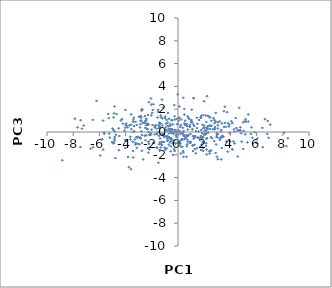
| Category | Series 0 |
|---|---|
| 6.047034312279502 | -0.993 |
| 1.8996415110933844 | -0.432 |
| 4.231998936353665 | -0.823 |
| 0.18424948059864074 | 0.434 |
| 3.832025674823919 | 0.765 |
| -3.248866115887301 | -0.96 |
| 2.361013082048552 | 1.36 |
| 2.519378961224598 | -0.454 |
| 0.8055621066655785 | -0.294 |
| 1.7405133993649038 | -0.354 |
| 3.6809694284060575 | -0.83 |
| 6.4729836015165505 | -1.332 |
| 1.1503002455104683 | -1.67 |
| -0.8302675615321096 | -0.552 |
| -0.7054473988117025 | 0.294 |
| 2.9548716284844923 | -0.358 |
| -3.1940596233818517 | -0.459 |
| 5.570983580629423 | -0.165 |
| 2.8751999732698335 | 1.681 |
| 1.2347217935646153 | 0.522 |
| 0.17790151491282047 | -0.185 |
| 3.9459608068082357 | -0.079 |
| 1.1096616695970796 | -1.199 |
| -3.925786178368599 | 0.572 |
| -2.21898946388357 | 2.611 |
| -6.6776213586947835 | -1.469 |
| -2.4793760931375233 | -0.722 |
| 0.6887620759695077 | 0.515 |
| -1.075818860944802 | -0.87 |
| 3.3772063206595346 | -0.333 |
| -2.7048244669344097 | 0.816 |
| -0.3198153434971519 | -0.745 |
| -4.918262225420026 | 1.279 |
| 1.988664589938669 | 2.692 |
| 0.47107407562630577 | -0.642 |
| -4.083281985070939 | 0.126 |
| 1.5669068762861806 | 0.048 |
| -2.89432349895327 | -0.485 |
| -2.528528512934547 | 1.397 |
| 0.41982239258789356 | -2.176 |
| 1.170124641809719 | -1.154 |
| -4.685951260612254 | 1.58 |
| -5.775517561604449 | -0.64 |
| -4.523972928316377 | 0.325 |
| -3.421533820116227 | 0.889 |
| -0.7757837348047522 | -0.715 |
| -1.5576950573239365 | 1.27 |
| 1.9193546418611314 | 0.329 |
| -0.2960340215029972 | -1.508 |
| -4.735814020955431 | -0.244 |
| -0.024902906210938623 | 0.059 |
| 1.4404870391792788 | -1.427 |
| 0.304540486284339 | -0.636 |
| 2.8747498922688752 | 0.923 |
| -1.045334313289163 | -0.288 |
| -2.42587581993685 | 1.046 |
| -2.7607142642447724 | -0.969 |
| 0.4854808519319678 | -0.341 |
| 5.676815686271187 | -0.51 |
| -2.636931687253922 | 0.791 |
| -0.7636856219395758 | -0.479 |
| 0.5521397763395441 | -0.544 |
| -1.6317442058879152 | 0.289 |
| 3.9664224242571438 | -0.098 |
| 8.382512100155447 | -0.542 |
| -3.7130340036089184 | 0.587 |
| -6.484427661128977 | -1.337 |
| -3.58727059686314 | 0.643 |
| 1.444864968422234 | 0.348 |
| -0.6792092444338018 | -0.458 |
| 1.604191951293681 | 1.05 |
| -2.1060598975750118 | -0.14 |
| 1.799950785334005 | -0.499 |
| 1.9866745134238675 | 0.553 |
| -0.6936915168886623 | -0.122 |
| 3.659139322017527 | 0.461 |
| 3.0450847434661554 | -2.384 |
| -3.065302933638145 | -0.417 |
| 0.48198570194440965 | 0.744 |
| 2.7916170805463723 | 0.773 |
| -0.9099055100206055 | 0.729 |
| 0.1184011563094833 | -0.932 |
| -4.508808416538954 | -1.596 |
| -1.7622735394111921 | 0.514 |
| 2.8167170306723492 | 0.441 |
| -5.283950764653616 | 1.22 |
| -0.35536315168584215 | -0.906 |
| -1.3796207045761866 | 0.74 |
| 5.850181587923567 | -0.007 |
| 2.501218291394947 | 0.539 |
| -2.5051904062654407 | 0.948 |
| -4.883248956831498 | -0.974 |
| 5.2981229512648005 | -0.909 |
| -0.265843969195275 | 1.381 |
| -1.2183488364663433 | -0.869 |
| 1.0209518362009546 | 0.963 |
| -0.8116686827692546 | -0.783 |
| -2.5355900747426117 | 0.802 |
| -1.1125451588328412 | -0.181 |
| -1.4187102640186997 | 0.354 |
| 1.1910837313397633 | 2.965 |
| -0.17987993146862838 | 0.17 |
| 2.38035865832213 | -1.701 |
| 1.1674781154926546 | 0.661 |
| 0.896058703423259 | 0.631 |
| 2.29369975550485 | 0.531 |
| 0.8605682314295295 | 1.156 |
| 0.1919262527514494 | -0.761 |
| 2.167766857991595 | -0.606 |
| -5.335974688399443 | 1.588 |
| 2.026666344309751 | 0.388 |
| -7.4352718826652335 | 1.036 |
| -2.2526189365044536 | -1.808 |
| 2.078826657869659 | -0.222 |
| 0.7950794284432429 | 1.214 |
| -1.072260631984391 | -0.403 |
| 4.578007614451878 | 0.134 |
| 1.2545820243692722 | -1.117 |
| -0.5745031944184031 | -0.622 |
| 5.1349374946405995 | -0.213 |
| -1.9731602613624752 | 1.68 |
| 1.746129268348774 | 1.242 |
| 4.0793424784092736 | 0.947 |
| 1.1964035936522326 | 2.989 |
| -4.926710473345753 | 0.181 |
| -1.3683910780709354 | -0.564 |
| 3.357360806661292 | 0.763 |
| -2.253547457461101 | -0.858 |
| 2.668259638364255 | 0.246 |
| 0.3912181161865333 | -0.072 |
| -2.3794163826329813 | 0.608 |
| -4.031219274384661 | 0.381 |
| -0.060685159703506575 | -0.185 |
| -1.196940878067872 | 1.199 |
| 7.037137703415545 | 0.646 |
| 5.3639202642871595 | 1.545 |
| -4.837399679571421 | -0.605 |
| 3.2972030561913166 | -2.404 |
| 3.05183030810398 | 0.588 |
| 3.3476779456081256 | -1.407 |
| -0.6088735106832407 | -0.912 |
| 0.6487391303288671 | -2.173 |
| 2.2635482388378416 | 0.255 |
| -3.3408332668856255 | 0.05 |
| -2.820178465602557 | 1.388 |
| -2.036105686398353 | 1.462 |
| 0.17883212730047535 | -1.029 |
| 2.214773910416551 | 3.139 |
| 0.03677559822935879 | 0.146 |
| -0.10913993238080572 | -0.446 |
| 2.6077615028975165 | -0.544 |
| 5.171701051093329 | 0.883 |
| 2.976557804743357 | -2.164 |
| -3.0950164000627454 | -1.021 |
| -1.37561535406722 | -0.896 |
| -1.3201166672341729 | 1.451 |
| 5.129643257385111 | 0.978 |
| -5.646186959080073 | -0.046 |
| 4.858941844176288 | -0.85 |
| 3.883483477206486 | 0.483 |
| 1.8667895634613403 | -0.859 |
| -3.56955972488989 | 0.253 |
| -2.4135282005126197 | 1.161 |
| -3.1399374133237914 | -1.386 |
| -3.7404637887237144 | -3.09 |
| -3.6414938096381726 | -0.419 |
| 0.7457903373359296 | -0.327 |
| -4.999764049003597 | 0.305 |
| -0.48197930424805785 | -0.612 |
| -1.306057718984843 | 1.29 |
| 0.20966533934059808 | 0.608 |
| -0.4549640433954234 | 1.02 |
| 0.6531337652449011 | -0.263 |
| -2.9006687161572584 | 0.403 |
| 2.1510506582522995 | -0.993 |
| -0.5628545948724457 | -1.693 |
| -2.4909828847752813 | 0.357 |
| -3.951921975157792 | 0.744 |
| -2.188455320186351 | -1.518 |
| 0.48607254936009703 | 2.024 |
| 4.676005043807557 | 2.122 |
| -0.8329172934726701 | 0.121 |
| -0.489546268189948 | -0.1 |
| -1.1922690174577741 | 0.568 |
| 4.974373277567726 | 0.851 |
| 5.15183279776188 | 1.132 |
| -3.2900763168464198 | -0.661 |
| 6.915032475166059 | -0.512 |
| -0.5371369421036476 | 0.024 |
| -2.2933761073852255 | 1.496 |
| -2.038306628919595 | 2.397 |
| -5.022280711415091 | -0.876 |
| 8.103514895787105 | -0.072 |
| 2.196412006253584 | -1.966 |
| 2.211276105571872 | 0.332 |
| -0.03822909725741992 | -0.935 |
| 0.41693204993621835 | -0.231 |
| -1.4690700429183854 | 0.539 |
| 0.21609716259945622 | -1.893 |
| 4.398923767171826 | 1.224 |
| -2.9559873926725304 | -1.077 |
| -0.6990674396214038 | -1.119 |
| 0.741736573228875 | -0.822 |
| -4.480858160981361 | -0.351 |
| -3.4264698778696454 | 0.022 |
| -1.600597377700655 | -1.39 |
| -4.885796096583559 | 1.644 |
| -0.4260989814584765 | 0.224 |
| 1.92708895849279 | -1.401 |
| 0.5491685861528357 | 0.985 |
| 2.269518862307452 | 1.416 |
| -0.9757271522930845 | -1.569 |
| -7.868204914744275 | 1.167 |
| -0.19393365712780597 | -1.014 |
| -7.32813316048994 | 0.291 |
| 5.613515969729701 | 0.412 |
| 4.551550030083382 | 0.151 |
| -1.01668455883147 | -1.385 |
| -2.1450243068492463 | -0.242 |
| -5.251283946846992 | -0.142 |
| 6.641669241047049 | 1.125 |
| -3.1426729571753738 | 0.627 |
| 3.347908054346751 | -0.474 |
| -7.662379318783151 | 0.404 |
| -2.7516484890229496 | 1.986 |
| 0.36433916856313386 | -0.094 |
| -4.010394318507968 | 1.935 |
| -4.835694013928485 | -0.435 |
| 2.1641833526285676 | -0.102 |
| 4.322076274231772 | -1 |
| 1.0671599860185046 | 0.843 |
| 4.557187977195853 | -2.151 |
| 1.9086075348808438 | -0.491 |
| 2.768848199425913 | -0.805 |
| 4.315713556342761 | 0.023 |
| 4.160113163312151 | -1.515 |
| 4.451618034816423 | 0.349 |
| 1.3711837440410723 | 0.081 |
| 0.0028828354311052854 | 0.713 |
| 3.985193969004374 | -0.833 |
| 0.5497601450805524 | 0.652 |
| 0.9692765573040615 | -0.928 |
| 2.443548107922166 | 1.277 |
| 1.875619893629662 | 0.632 |
| 0.6504645258498203 | 0.701 |
| -2.5380621159533057 | -0.325 |
| 3.0333579158271373 | -0.202 |
| 2.5544832723648705 | 0.546 |
| -1.6978911771575893 | 0.606 |
| -0.6635920982255893 | 0.136 |
| 2.3036036512740883 | -0.06 |
| -0.9910702160562156 | 1.219 |
| 0.04306738680921615 | 0.993 |
| -1.426987550631293 | -1.072 |
| 3.472186797912858 | -0.406 |
| -3.5971737472246996 | -3.265 |
| 3.5077666757047608 | 0.426 |
| 1.7337204666559332 | 1.264 |
| -2.9719120533050356 | 1.331 |
| 4.984095658307841 | -1.491 |
| 0.3855663804869246 | -1.681 |
| 0.7189320300959903 | -0.674 |
| -0.5400285559038406 | -0.8 |
| 0.8782495796683037 | -0.947 |
| 2.135183910675068 | 0.122 |
| 4.141395778146035 | 0.779 |
| 0.1105473963213436 | 2.239 |
| -1.1640488954010304 | -0.168 |
| 0.24427713496837652 | -0.047 |
| -1.9050720110889148 | -0.971 |
| 3.5906160793249557 | 0.799 |
| -1.312147238866422 | 0.742 |
| 6.443899562331703 | 0.36 |
| 0.41042072378681616 | 2.998 |
| -0.4009239843461888 | -1.001 |
| -4.0320376467337535 | -0.689 |
| -1.4897453573352928 | -2.698 |
| -1.0170673464369921 | -0.433 |
| 8.269540730532281 | -1.232 |
| -0.399373113784695 | 0.028 |
| -2.8584129712751274 | 0.99 |
| 3.171914590075943 | -0.535 |
| 2.1437519014874202 | -1.224 |
| 0.23674044001403804 | 1.104 |
| -1.5057340580024057 | 1.756 |
| 1.9871911531229858 | -0.227 |
| 2.436230753152055 | 0.273 |
| 0.40080171636689327 | -1.789 |
| -0.5416849614417221 | 0.055 |
| 3.5724659264159837 | 2.218 |
| 1.2783495333475259 | -1.489 |
| 0.21673990004526614 | -1.254 |
| -1.6093393923122334 | -0.179 |
| 0.744090429973274 | 1.376 |
| 2.219127345039516 | 0.402 |
| 1.760189427436579 | 1.399 |
| 1.2646934429834238 | -0.42 |
| -0.14402850574758402 | -0.026 |
| 2.047474027248973 | -0.129 |
| -1.3085643622877894 | -0.185 |
| 2.963473096183228 | -0.126 |
| 2.4234529397112285 | 0.571 |
| -1.7728229175626264 | -0.201 |
| -1.4738463484735909 | -0.342 |
| -0.5917512547639558 | 0.555 |
| -3.5837872623634968 | 1.541 |
| -2.813215209952402 | 1.26 |
| 0.9041904948244234 | 0.452 |
| 1.884509395601381 | -1.339 |
| 0.5665844944165647 | 0.612 |
| 2.178831302568159 | -1.536 |
| 2.9591571389372184 | -0.449 |
| -0.10974792557923045 | 1.146 |
| -2.7966614531879057 | 0.058 |
| 0.040289778310177486 | -1.235 |
| -0.5526332342286402 | -0.524 |
| -7.1957231645719615 | 0.563 |
| -3.2514698048984796 | -1.087 |
| 1.2906381873054185 | -0.349 |
| -5.206567823952191 | -0.5 |
| -1.5056894929178406 | 1.939 |
| -2.7531919484199046 | -0.26 |
| -2.066329767806902 | 2.935 |
| 2.7737807023116416 | 0.231 |
| 1.7654228198123156 | -0.425 |
| -0.892850003987584 | 0.172 |
| -2.9223277660999885 | 1.339 |
| -0.7826849217721955 | 0.838 |
| -2.7165483653798623 | 1.992 |
| 0.7017565436905016 | -1.081 |
| -3.4357931527859047 | -1.668 |
| -0.061757477494494846 | 0.685 |
| 0.36238009827495304 | 0.367 |
| -3.9582153900764374 | -0.783 |
| -4.0112515253361645 | -1.403 |
| 2.819336557888662 | 0.275 |
| -1.634174681110645 | -1.367 |
| 5.951756188555769 | -0.897 |
| -2.3433948746141953 | 0.739 |
| 0.01755031365638394 | -1.002 |
| -4.351525718476621 | 1.015 |
| -0.8629603390129279 | -1.44 |
| 2.428408971259546 | -1.884 |
| -0.8665434779071359 | -0.344 |
| 0.6779884854034169 | -1.24 |
| -1.222111910478527 | 2.84 |
| -0.8751009123786065 | 1.061 |
| -1.9446690423147828 | 0.613 |
| -0.2567339256345365 | -1.666 |
| 0.9447502615435426 | -0.85 |
| 3.27867599672839 | -0.447 |
| 0.018280134439837913 | 1.205 |
| -1.4194635302972962 | 0.318 |
| 0.9530074053599842 | -0.177 |
| 1.8392588839025878 | -0.092 |
| 1.268401153465712 | -0.468 |
| 3.2006473266735944 | -0.705 |
| 0.4285439897324006 | -0.337 |
| -0.3190317395291969 | -0.122 |
| 0.09850067200732582 | 1.256 |
| -0.35957031548069657 | -0.14 |
| -0.5374888632367044 | 0.267 |
| 2.0652196956974063 | 0.132 |
| 6.815826684732136 | -0.171 |
| -3.451744778899121 | -0.859 |
| 3.0486045076862185 | 0.312 |
| 0.5869293591997515 | -0.477 |
| -3.376465422226416 | 1.249 |
| 1.8894788909823699 | 1.485 |
| -0.9544397451888526 | 0.381 |
| -0.5342114892369141 | -1.265 |
| -1.3101472198011623 | -1.361 |
| 3.9118599407399257 | 0.642 |
| 1.8185150317864107 | -1.103 |
| -1.7730891088757106 | 0.42 |
| 2.5472198096660814 | 0.979 |
| 3.5076308503305875 | 1.824 |
| -2.3734117744357826 | 0.274 |
| -4.200522662347694 | 0.725 |
| -4.83954832785492 | 2.237 |
| 2.166990817958821 | 0.872 |
| -1.5534445518627698 | -0.012 |
| 2.10497790830835 | 1.457 |
| 4.823061642684035 | -0.11 |
| 2.9886546727881185 | -0.453 |
| 1.028729812791512 | 1.052 |
| -0.7754574637226594 | 1.66 |
| -0.9843748541728148 | 1.352 |
| 1.6704088852299404 | -0.593 |
| 1.9196973974887932 | -1.659 |
| -2.1708598667548182 | -0.264 |
| 0.48439735250297894 | 1.526 |
| 0.3217223568320174 | -0.652 |
| -0.6866947253047454 | 1.163 |
| -0.3887470911654232 | 0.657 |
| 1.112838704949429 | 0.235 |
| -2.2385278255882732 | 0.652 |
| -0.8073379005027115 | 0.528 |
| -1.2752388683836435 | -1.057 |
| 6.850739977321383 | 0.967 |
| 3.3067354023700934 | 0.18 |
| 1.564608242672751 | -0.508 |
| -0.025117424530277866 | 3.3 |
| -6.214967190244098 | 2.731 |
| 0.09933174805065141 | -0.873 |
| -1.1324401688901602 | 2.151 |
| -5.635380277313017 | -0.158 |
| -4.837404447177381 | 0.051 |
| 1.4719018092198042 | -0.468 |
| 1.3517675140487244 | -1.865 |
| -0.7019789059469953 | 0.533 |
| 2.5131412651061185 | -1.616 |
| -5.72123333303111 | 0.994 |
| -2.014164015814268 | 0.201 |
| 0.8942304653291152 | 0.463 |
| 6.054927318109329 | -0.557 |
| 3.7973222928816215 | -1.719 |
| 0.6366690373922368 | -0.432 |
| -1.4262571637155141 | 0.824 |
| -0.5803853315952024 | 0.706 |
| -2.8715830633176536 | -0.566 |
| -2.330532540887414 | 0.662 |
| 1.196425198079785 | -0.585 |
| 1.0113769602965343 | 0.867 |
| 2.8649475451341426 | -1.84 |
| 3.2743127480932928 | 0.046 |
| -2.869718407290257 | 0.682 |
| -2.4237139092930042 | 0.6 |
| 4.141449680893687 | -1.513 |
| -3.411277132001403 | 1.063 |
| -2.817410954452455 | 1.004 |
| -3.9868745413475524 | 0.609 |
| 4.67782221169768 | 0.142 |
| 1.7543764035865872 | -1.585 |
| 1.051999056145366 | 1.955 |
| -2.790868402150002 | 1.87 |
| 1.7704062778386687 | 0.167 |
| 0.12401237120291202 | 0.068 |
| 3.1799071761298032 | 0.941 |
| 5.361504518740549 | 0.913 |
| -1.8883890094512246 | 2.434 |
| -3.2373129892093515 | 0.891 |
| -0.2792637809352672 | 2.359 |
| -3.818231973651489 | -2.195 |
| -3.83703717393408 | 0.396 |
| -0.4888746261523889 | 1.049 |
| -3.0886101371955617 | -0.496 |
| 2.909541062041676 | -1.097 |
| 1.1406231747929871 | -0.361 |
| 1.9903866291446957 | -0.952 |
| -7.445491731780676 | -1.326 |
| -1.8303979776276063 | -0.953 |
| 4.273050938336929 | 0.236 |
| -3.6305706857677347 | -0.658 |
| -0.1575515389461717 | -0.297 |
| -1.2195606599022504 | -1.155 |
| 4.756378007273933 | 0.406 |
| -1.4059292445124756 | -1.573 |
| 0.5505768716571143 | 0.679 |
| -2.2224255279515615 | -1.044 |
| -0.24519559706173527 | 1.093 |
| -2.3160081339156884 | 0.248 |
| -4.7709991072813525 | -2.289 |
| 3.7493518496486677 | 1.733 |
| -5.935374709067165 | -2.064 |
| -5.716835961357377 | -1.534 |
| 0.4303082730697645 | 0.078 |
| -8.829190777547362 | -2.481 |
| -3.343653974682608 | 0.529 |
| -0.7787844360219335 | -0.39 |
| -3.4300419349017885 | -2.233 |
| 2.9945921093992913 | -0.142 |
| -1.3779660020607556 | 0.428 |
| 5.015312178180174 | 0.098 |
| 0.33723421137061105 | -1.316 |
| -2.656018576386782 | -2.399 |
| -2.2473701630244176 | 0.002 |
| -1.924227963520575 | 1.934 |
| -2.43318632715931 | -0.292 |
| 2.779470019354117 | 1.049 |
| -0.37798782467605924 | -2.012 |
| 1.0824490542167071 | 0.233 |
| -4.843176135695533 | -0.777 |
| -1.474033467164469 | 0.592 |
| -4.9478826032185115 | -0.996 |
| 1.445484495105573 | 1.25 |
| -2.868820019986131 | -0.513 |
| 2.2187341098117326 | -0.534 |
| -6.506203064036894 | 1.062 |
| -0.2262474709181512 | 0.178 |
| 4.770850340203871 | 0.139 |
| 2.712659648420735 | 1.221 |
| 3.0454862931602853 | 0.859 |
| -2.749757349205495 | -1.646 |
| -4.275078346586217 | 1.123 |
| 2.464057662300153 | -1.655 |
| -0.35576820671986004 | 0.011 |
| 0.7443202341146535 | 0.214 |
| 1.4812248957789003 | 0.715 |
| -2.2824164523979382 | -1.408 |